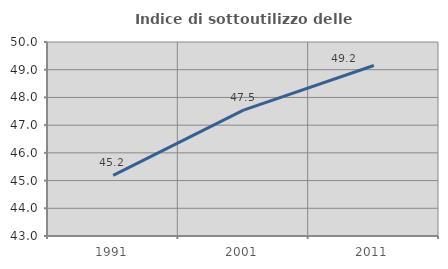
| Category | Indice di sottoutilizzo delle abitazioni  |
|---|---|
| 1991.0 | 45.188 |
| 2001.0 | 47.544 |
| 2011.0 | 49.153 |